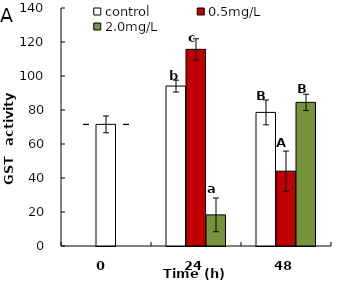
| Category | control | 0.5mg/L | 2.0mg/L |
|---|---|---|---|
| 0.0 | 71.548 | 71.548 | 71.548 |
| 24.0 | 94.075 | 115.677 | 18.302 |
| 48.0 | 78.586 | 44.011 | 84.499 |